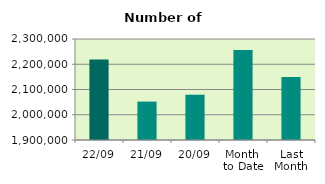
| Category | Series 0 |
|---|---|
| 22/09 | 2218908 |
| 21/09 | 2052142 |
| 20/09 | 2079350 |
| Month 
to Date | 2256214 |
| Last
Month | 2149140 |